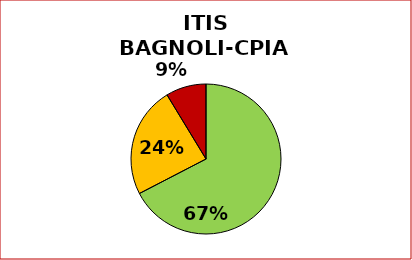
| Category | Series 0 |
|---|---|
| SUPERATI | 124 |
| PARZIAL.NTE SUPERATI | 44 |
| NON SUPERATI | 16 |